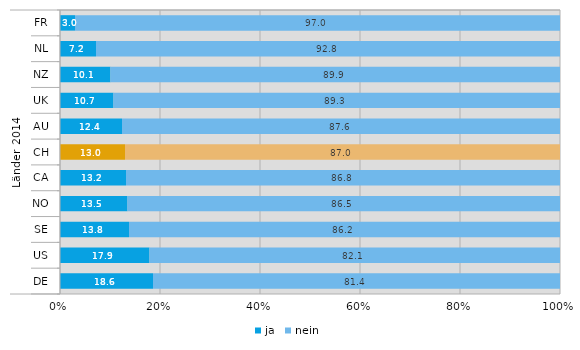
| Category | ja | nein |
|---|---|---|
| 0 | 3 | 97 |
| 1 | 7.2 | 92.8 |
| 2 | 10.1 | 89.9 |
| 3 | 10.7 | 89.3 |
| 4 | 12.4 | 87.6 |
| 5 | 13 | 87 |
| 6 | 13.2 | 86.8 |
| 7 | 13.5 | 86.5 |
| 8 | 13.8 | 86.2 |
| 9 | 17.9 | 82.1 |
| 10 | 18.6 | 81.4 |